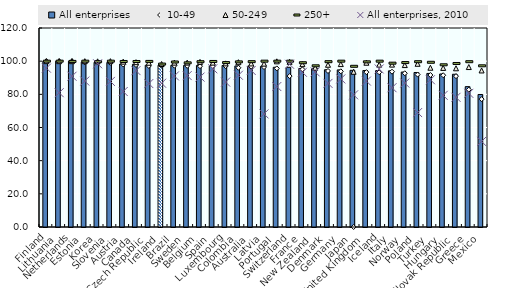
| Category | All enterprises |
|---|---|
| Finland | 100 |
| Lithuania | 100 |
| Netherlands | 99.995 |
| Estonia | 99.418 |
| Korea | 99.3 |
| Slovenia | 99.207 |
| Austria | 98.279 |
| Canada | 98.1 |
| Czech Republic | 97.559 |
| Ireland | 97.538 |
| Brazil | 97.5 |
| Sweden | 97.476 |
| Belgium | 97.41 |
| Spain | 97.389 |
| Luxembourg | 97.384 |
| Colombia | 97.12 |
| Australia | 97.01 |
| Latvia | 96.851 |
| Portugal | 96.312 |
| Switzerland | 96.3 |
| France | 95.549 |
| New Zealand | 95.409 |
| Denmark | 94.842 |
| Germany | 94.743 |
| Japan | 94.5 |
| United Kingdom | 94.337 |
| Iceland | 94.3 |
| Italy | 94.17 |
| Norway | 93.444 |
| Poland | 93.169 |
| Turkey | 92.608 |
| Hungary | 92.28 |
| Slovak Republic | 92.109 |
| Greece | 84.643 |
| Mexico | 79.9 |